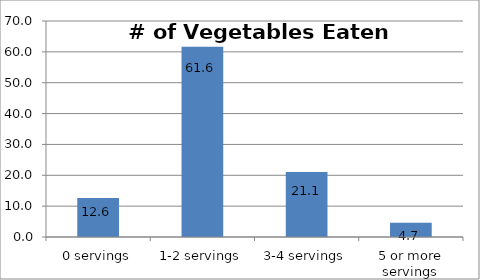
| Category | Series 0 |
|---|---|
| 0 servings | 12.622 |
| 1-2 servings | 61.634 |
| 3-4 servings | 21.09 |
| 5 or more servings | 4.654 |